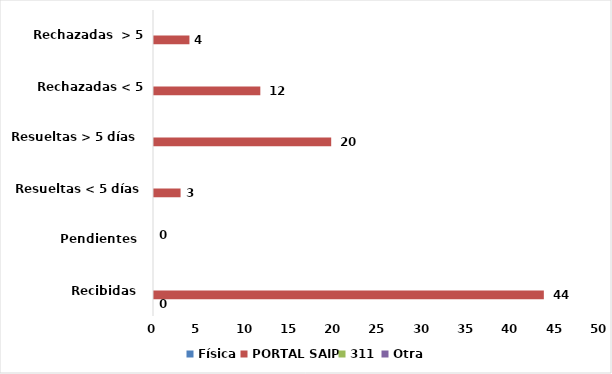
| Category | Física | PORTAL SAIP | 311 | Otra |
|---|---|---|---|---|
| Recibidas  | 0 | 44 | 0 | 0 |
| Pendientes  | 0 | 0 | 0 | 0 |
| Resueltas < 5 días | 0 | 3 | 0 | 0 |
| Resueltas > 5 días  | 0 | 20 | 0 | 0 |
| Rechazadas < 5 días  | 0 | 12 | 0 | 0 |
| Rechazadas  > 5 días | 0 | 4 | 0 | 0 |